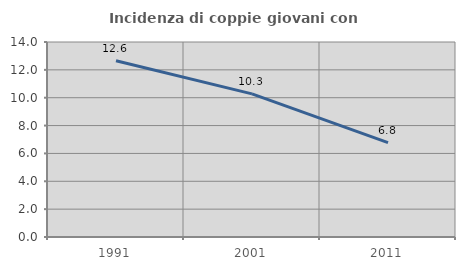
| Category | Incidenza di coppie giovani con figli |
|---|---|
| 1991.0 | 12.648 |
| 2001.0 | 10.277 |
| 2011.0 | 6.773 |